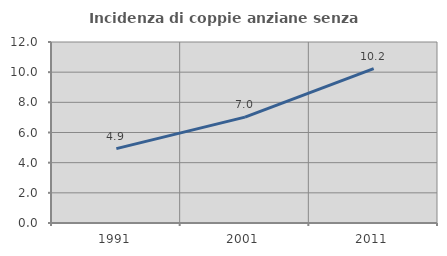
| Category | Incidenza di coppie anziane senza figli  |
|---|---|
| 1991.0 | 4.93 |
| 2001.0 | 7.018 |
| 2011.0 | 10.24 |